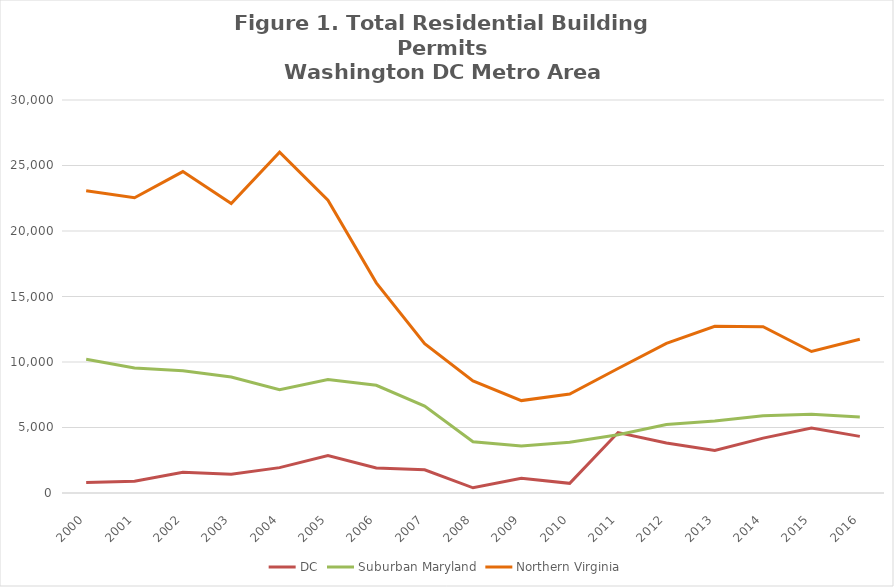
| Category | DC | Suburban Maryland | Northern Virginia |
|---|---|---|---|
| 2000.0 | 806 | 10214 | 23069 |
| 2001.0 | 896 | 9545 | 22541 |
| 2002.0 | 1591 | 9326 | 24537 |
| 2003.0 | 1427 | 8849 | 22102 |
| 2004.0 | 1936 | 7886 | 26013 |
| 2005.0 | 2860 | 8662 | 22356 |
| 2006.0 | 1908 | 8224 | 16040 |
| 2007.0 | 1772 | 6635 | 11406 |
| 2008.0 | 396 | 3918 | 8553 |
| 2009.0 | 1126 | 3595 | 7053 |
| 2010.0 | 739 | 3879 | 7556 |
| 2011.0 | 4612 | 4453 | 9505 |
| 2012.0 | 3823 | 5232 | 11422 |
| 2013.0 | 3255 | 5495 | 12722 |
| 2014.0 | 4189 | 5888 | 12697 |
| 2015.0 | 4956 | 6002 | 10801 |
| 2016.0 | 4321 | 5806 | 11739 |